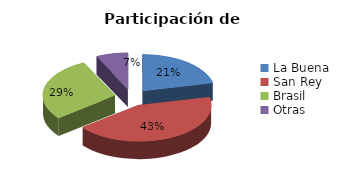
| Category | Participación de mercado |
|---|---|
| La Buena  | 0.214 |
| San Rey | 0.429 |
| Brasil | 0.286 |
| Otras | 0.071 |